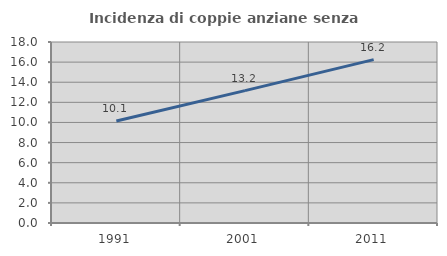
| Category | Incidenza di coppie anziane senza figli  |
|---|---|
| 1991.0 | 10.141 |
| 2001.0 | 13.161 |
| 2011.0 | 16.245 |